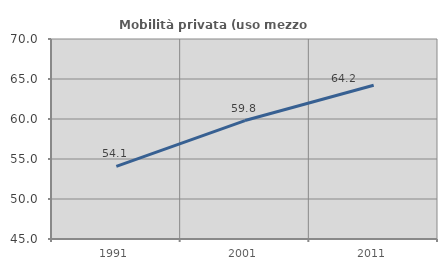
| Category | Mobilità privata (uso mezzo privato) |
|---|---|
| 1991.0 | 54.074 |
| 2001.0 | 59.804 |
| 2011.0 | 64.214 |